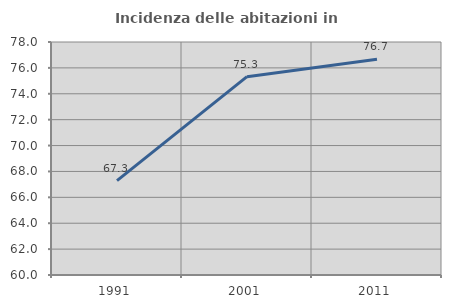
| Category | Incidenza delle abitazioni in proprietà  |
|---|---|
| 1991.0 | 67.29 |
| 2001.0 | 75.322 |
| 2011.0 | 76.673 |